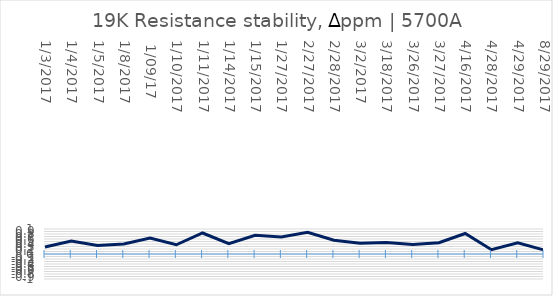
| Category | Series 0 |
|---|---|
| 1/3/2017 | 0.28 |
| 1/4/2017 | 0.52 |
| 1/5/2017 | 0.34 |
| 1/8/2017 | 0.4 |
|  1/09/17 | 0.64 |
| 1/10/2017 | 0.37 |
| 1/11/2017 | 0.84 |
| 1/14/2017 | 0.41 |
| 1/15/2017 | 0.75 |
| 1/27/2017 | 0.68 |
| 2/27/2017 | 0.87 |
| 2/28/2017 | 0.55 |
| 3/2/2017 | 0.43 |
| 3/18/2017 | 0.46 |
| 3/26/2017 | 0.38 |
| 3/27/2017 | 0.45 |
| 4/16/2017 | 0.82 |
| 4/28/2017 | 0.17 |
| 4/29/2017 | 0.45 |
| 8/29/2017 | 0.16 |